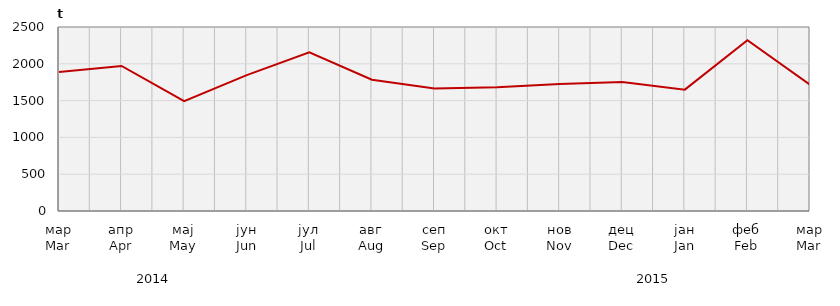
| Category | Нето тежина заклане стоке                              Net weight of  slaughtered livestock |
|---|---|
| мар
Mar | 1889500 |
| апр
Apr | 1970100 |
| мај
May | 1492412.5 |
| јун
Jun | 1846464.11 |
| јул
Jul | 2155166.5 |
| авг
Aug | 1783969.1 |
| сеп
Sep | 1665798.6 |
| окт
Oct | 1681528.4 |
| нов
Nov | 1726709.59 |
| дец
Dec | 1751098 |
| јан
Jan | 1649074.16 |
| феб
Feb | 2321007.9 |
| мар
Mar | 1714725.6 |